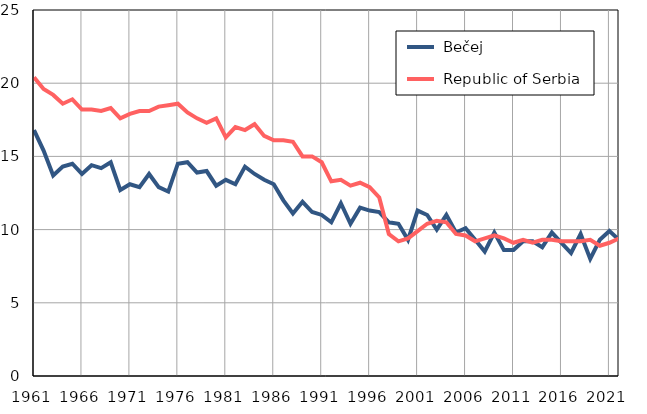
| Category |  Bečej |  Republic of Serbia |
|---|---|---|
| 1961.0 | 16.8 | 20.4 |
| 1962.0 | 15.4 | 19.6 |
| 1963.0 | 13.7 | 19.2 |
| 1964.0 | 14.3 | 18.6 |
| 1965.0 | 14.5 | 18.9 |
| 1966.0 | 13.8 | 18.2 |
| 1967.0 | 14.4 | 18.2 |
| 1968.0 | 14.2 | 18.1 |
| 1969.0 | 14.6 | 18.3 |
| 1970.0 | 12.7 | 17.6 |
| 1971.0 | 13.1 | 17.9 |
| 1972.0 | 12.9 | 18.1 |
| 1973.0 | 13.8 | 18.1 |
| 1974.0 | 12.9 | 18.4 |
| 1975.0 | 12.6 | 18.5 |
| 1976.0 | 14.5 | 18.6 |
| 1977.0 | 14.6 | 18 |
| 1978.0 | 13.9 | 17.6 |
| 1979.0 | 14 | 17.3 |
| 1980.0 | 13 | 17.6 |
| 1981.0 | 13.4 | 16.3 |
| 1982.0 | 13.1 | 17 |
| 1983.0 | 14.3 | 16.8 |
| 1984.0 | 13.8 | 17.2 |
| 1985.0 | 13.4 | 16.4 |
| 1986.0 | 13.1 | 16.1 |
| 1987.0 | 12 | 16.1 |
| 1988.0 | 11.1 | 16 |
| 1989.0 | 11.9 | 15 |
| 1990.0 | 11.2 | 15 |
| 1991.0 | 11 | 14.6 |
| 1992.0 | 10.5 | 13.3 |
| 1993.0 | 11.8 | 13.4 |
| 1994.0 | 10.4 | 13 |
| 1995.0 | 11.5 | 13.2 |
| 1996.0 | 11.3 | 12.9 |
| 1997.0 | 11.2 | 12.2 |
| 1998.0 | 10.5 | 9.7 |
| 1999.0 | 10.4 | 9.2 |
| 2000.0 | 9.3 | 9.4 |
| 2001.0 | 11.3 | 9.9 |
| 2002.0 | 11 | 10.4 |
| 2003.0 | 10 | 10.6 |
| 2004.0 | 11 | 10.5 |
| 2005.0 | 9.8 | 9.7 |
| 2006.0 | 10.1 | 9.6 |
| 2007.0 | 9.3 | 9.2 |
| 2008.0 | 8.5 | 9.4 |
| 2009.0 | 9.8 | 9.6 |
| 2010.0 | 8.6 | 9.4 |
| 2011.0 | 8.6 | 9.1 |
| 2012.0 | 9.2 | 9.3 |
| 2013.0 | 9.2 | 9.1 |
| 2014.0 | 8.8 | 9.3 |
| 2015.0 | 9.8 | 9.3 |
| 2016.0 | 9.1 | 9.2 |
| 2017.0 | 8.4 | 9.2 |
| 2018.0 | 9.7 | 9.2 |
| 2019.0 | 8 | 9.3 |
| 2020.0 | 9.3 | 8.9 |
| 2021.0 | 9.9 | 9.1 |
| 2022.0 | 9.3 | 9.4 |